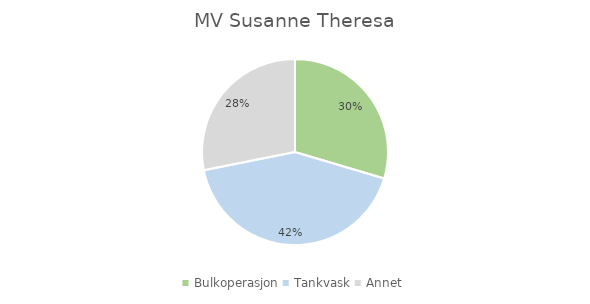
| Category | Series 0 |
|---|---|
| Bulkoperasjon | 0.296 |
| Tankvask | 0.423 |
| Annet | 0.281 |